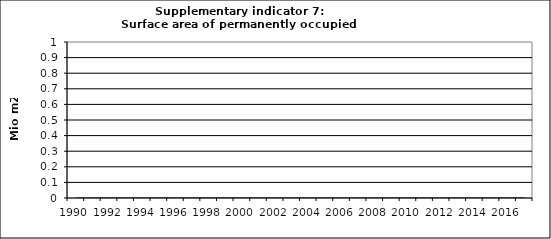
| Category | Surface area of permanently occupied dwellings, Mio m2  |
|---|---|
| 1990 | 0 |
| 1991 | 0 |
| 1992 | 0 |
| 1993 | 0 |
| 1994 | 0 |
| 1995 | 0 |
| 1996 | 0 |
| 1997 | 0 |
| 1998 | 0 |
| 1999 | 0 |
| 2000 | 0 |
| 2001 | 0 |
| 2002 | 0 |
| 2003 | 0 |
| 2004 | 0 |
| 2005 | 0 |
| 2006 | 0 |
| 2007 | 0 |
| 2008 | 0 |
| 2009 | 0 |
| 2010 | 0 |
| 2011 | 0 |
| 2012 | 0 |
| 2013 | 0 |
| 2014 | 0 |
| 2015 | 0 |
| 2016 | 0 |
| 2017 | 0 |